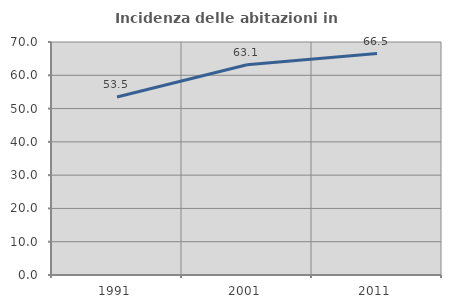
| Category | Incidenza delle abitazioni in proprietà  |
|---|---|
| 1991.0 | 53.465 |
| 2001.0 | 63.15 |
| 2011.0 | 66.52 |